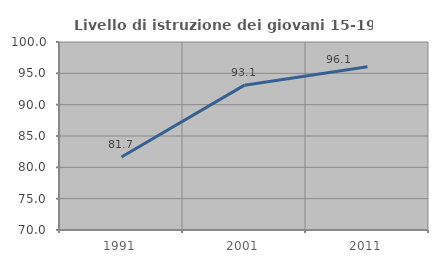
| Category | Livello di istruzione dei giovani 15-19 anni |
|---|---|
| 1991.0 | 81.657 |
| 2001.0 | 93.113 |
| 2011.0 | 96.053 |